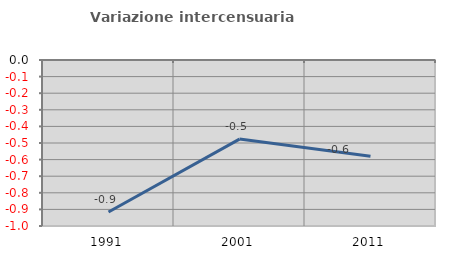
| Category | Variazione intercensuaria annua |
|---|---|
| 1991.0 | -0.916 |
| 2001.0 | -0.476 |
| 2011.0 | -0.58 |